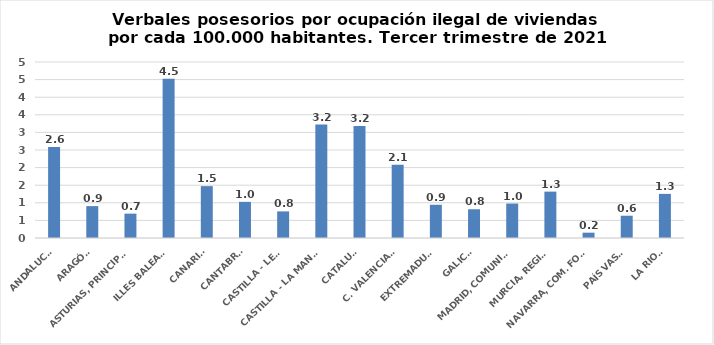
| Category | Series 0 |
|---|---|
| ANDALUCÍA | 2.583 |
| ARAGÓN | 0.905 |
| ASTURIAS, PRINCIPADO | 0.692 |
| ILLES BALEARS | 4.521 |
| CANARIAS | 1.474 |
| CANTABRIA | 1.027 |
| CASTILLA - LEÓN | 0.756 |
| CASTILLA - LA MANCHA | 3.223 |
| CATALUÑA | 3.184 |
| C. VALENCIANA | 2.079 |
| EXTREMADURA | 0.944 |
| GALICIA | 0.817 |
| MADRID, COMUNIDAD | 0.978 |
| MURCIA, REGIÓN | 1.318 |
| NAVARRA, COM. FORAL | 0.151 |
| PAÍS VASCO | 0.633 |
| LA RIOJA | 1.253 |